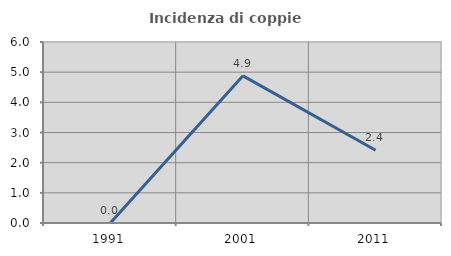
| Category | Incidenza di coppie miste |
|---|---|
| 1991.0 | 0 |
| 2001.0 | 4.878 |
| 2011.0 | 2.41 |